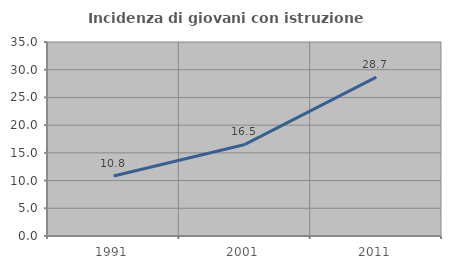
| Category | Incidenza di giovani con istruzione universitaria |
|---|---|
| 1991.0 | 10.819 |
| 2001.0 | 16.519 |
| 2011.0 | 28.662 |